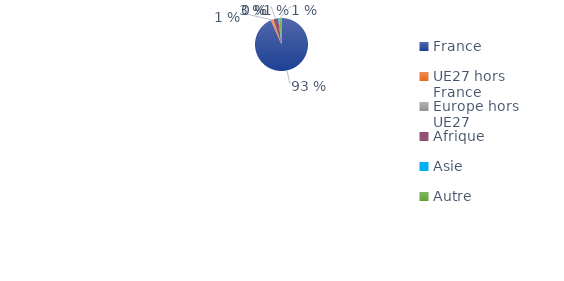
| Category | Series 0 |
|---|---|
| France | 0.934 |
| UE27 hors France | 0.013 |
| Europe hors UE27 | 0.004 |
| Afrique | 0.029 |
| Asie | 0.006 |
| Autre | 0.014 |